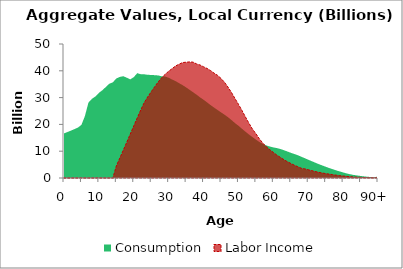
| Category | Consumption | Labor Income |
|---|---|---|
| 0 | 16642.318 | 0 |
|  | 17155.469 | 0 |
| 2 | 17690.129 | 0 |
| 3 | 18243.301 | 0 |
| 4 | 18816.318 | 0 |
| 5 | 19837.849 | 0 |
| 6 | 23141.5 | 0 |
| 7 | 28118.425 | 0 |
| 8 | 29545.823 | 0 |
| 9 | 30415.14 | 0 |
| 10 | 31763.177 | 0 |
| 11 | 32753.051 | 0 |
| 12 | 33968.393 | 0 |
| 13 | 35189.289 | 0 |
| 14 | 35707.979 | 0 |
| 15 | 37138.076 | 4511.737 |
| 16 | 37718.042 | 7447.023 |
| 17 | 37970.895 | 10396.821 |
| 18 | 37421.653 | 13381.473 |
| 19 | 36811.224 | 16397.257 |
| 20 | 37631.228 | 19418.341 |
| 21 | 39110.221 | 22453.129 |
| 22 | 38717.786 | 25393.484 |
| 23 | 38692.583 | 28140.368 |
| 24 | 38511.503 | 30265.253 |
| 25 | 38443.278 | 32172.894 |
| 26 | 38368.337 | 34066.734 |
| 27 | 38266.635 | 35841.452 |
| 28 | 37962.355 | 37417.414 |
| 29 | 37868.091 | 38690.214 |
| 30 | 37403.762 | 39840.805 |
| 31 | 36744.769 | 40823.71 |
| 32 | 36142.459 | 41817.512 |
| 33 | 35376.639 | 42460.615 |
| 34 | 34650.107 | 43085.359 |
| 35 | 33799.722 | 43199.216 |
| 36 | 32912.264 | 43310.673 |
| 37 | 31996.932 | 43227.818 |
| 38 | 31095.311 | 42569.253 |
| 39 | 30090.46 | 42158.487 |
| 40 | 29196.705 | 41505.242 |
| 41 | 28222.117 | 40881.863 |
| 42 | 27233.431 | 40109.931 |
| 43 | 26288.762 | 39141.358 |
| 44 | 25397.984 | 38311.666 |
| 45 | 24483.114 | 37155.202 |
| 46 | 23650.11 | 35722.819 |
| 47 | 22690.405 | 33929.753 |
| 48 | 21638.847 | 31908.155 |
| 49 | 20496.497 | 29679.562 |
| 50 | 19508.203 | 27515.976 |
| 51 | 18384.083 | 25241.405 |
| 52 | 17303.618 | 22795.627 |
| 53 | 16263.373 | 20465.799 |
| 54 | 15290.111 | 18299.742 |
| 55 | 14332.545 | 16544.515 |
| 56 | 13444.766 | 14647.503 |
| 57 | 12694.911 | 12998.279 |
| 58 | 12142.153 | 11660.908 |
| 59 | 11753.174 | 10543.898 |
| 60 | 11426.411 | 9560.66 |
| 61 | 11158.258 | 8551.51 |
| 62 | 10832.784 | 7706.945 |
| 63 | 10384.534 | 6864.606 |
| 64 | 9906.575 | 6105.247 |
| 65 | 9415.075 | 5429.675 |
| 66 | 8981.601 | 4783.824 |
| 67 | 8500.908 | 4227.545 |
| 68 | 7951.031 | 3642.001 |
| 69 | 7399.457 | 3414.695 |
| 70 | 6834.632 | 3083.928 |
| 71 | 6279.313 | 2752.853 |
| 72 | 5731.106 | 2394.458 |
| 73 | 5189.271 | 2133.348 |
| 74 | 4698.433 | 1871.479 |
| 75 | 4203.596 | 1646.468 |
| 76 | 3723.518 | 1448.07 |
| 77 | 3280.841 | 1254.26 |
| 78 | 2852.367 | 1060.003 |
| 79 | 2463.869 | 898.234 |
| 80 | 2081.234 | 751.272 |
| 81 | 1711.534 | 605.053 |
| 82 | 1399.174 | 483.682 |
| 83 | 1149.983 | 385.381 |
| 84 | 948.618 | 307.897 |
| 85 | 764.079 | 240.384 |
| 86 | 600.078 | 183.22 |
| 87 | 463.992 | 137.054 |
| 88 | 352.326 | 100.595 |
| 89 | 262.277 | 72.342 |
| 90+ | 590.222 | 157.067 |